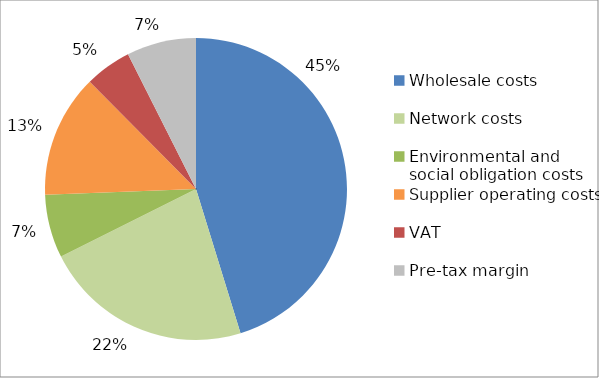
| Category | Series 0 |
|---|---|
| Wholesale costs | 0.453 |
| Network costs | 0.224 |
| Environmental and social obligation costs | 0.068 |
| Supplier operating costs | 0.132 |
| VAT | 0.05 |
| Pre-tax margin | 0.075 |